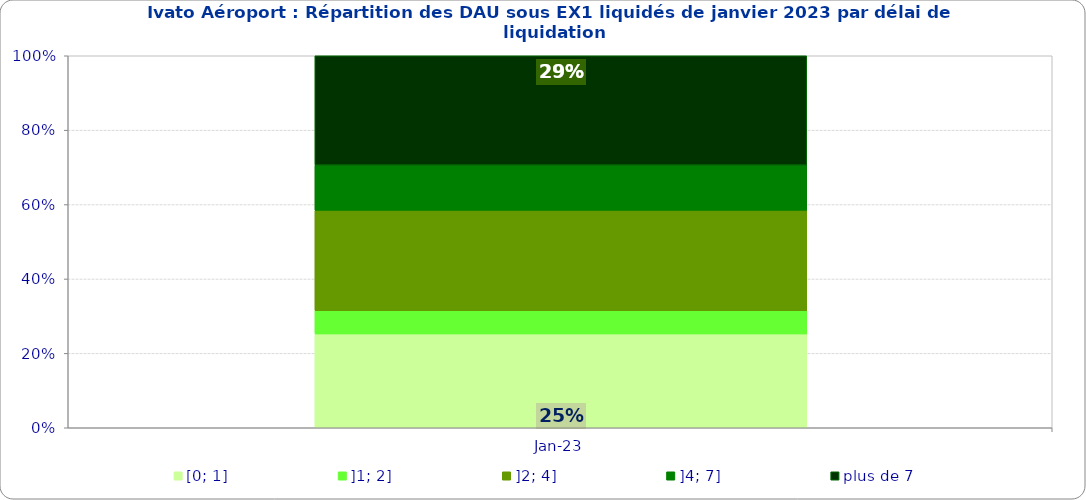
| Category | [0; 1] | ]1; 2] | ]2; 4] | ]4; 7] | plus de 7 |
|---|---|---|---|---|---|
| 2023-01-01 | 0.252 | 0.062 | 0.27 | 0.122 | 0.294 |